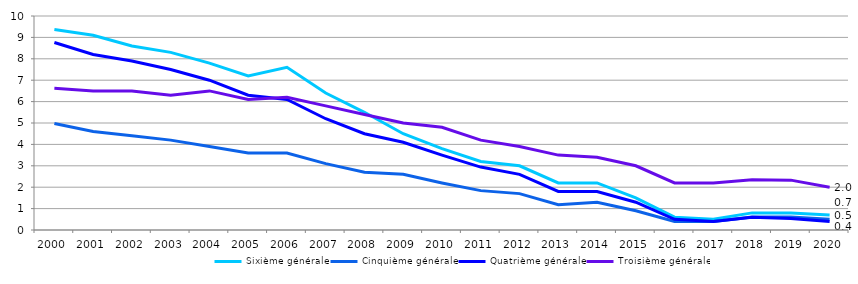
| Category | Sixième générale | Cinquième générale | Quatrième générale | Troisième générale |
|---|---|---|---|---|
| 2000.0 | 9.365 | 4.978 | 8.761 | 6.62 |
| 2001.0 | 9.1 | 4.6 | 8.2 | 6.5 |
| 2002.0 | 8.6 | 4.4 | 7.9 | 6.5 |
| 2003.0 | 8.3 | 4.2 | 7.5 | 6.3 |
| 2004.0 | 7.8 | 3.9 | 7 | 6.5 |
| 2005.0 | 7.2 | 3.6 | 6.3 | 6.1 |
| 2006.0 | 7.6 | 3.6 | 6.1 | 6.2 |
| 2007.0 | 6.4 | 3.1 | 5.2 | 5.8 |
| 2008.0 | 5.5 | 2.7 | 4.5 | 5.4 |
| 2009.0 | 4.5 | 2.6 | 4.1 | 5 |
| 2010.0 | 3.8 | 2.2 | 3.5 | 4.8 |
| 2011.0 | 3.2 | 1.84 | 2.94 | 4.2 |
| 2012.0 | 3 | 1.7 | 2.6 | 3.9 |
| 2013.0 | 2.2 | 1.18 | 1.8 | 3.5 |
| 2014.0 | 2.2 | 1.3 | 1.8 | 3.4 |
| 2015.0 | 1.5 | 0.9 | 1.3 | 3 |
| 2016.0 | 0.6 | 0.4 | 0.5 | 2.2 |
| 2017.0 | 0.5 | 0.4 | 0.4 | 2.2 |
| 2018.0 | 0.8 | 0.61 | 0.59 | 2.35 |
| 2019.0 | 0.8 | 0.61 | 0.54 | 2.33 |
| 2020.0 | 0.7 | 0.5 | 0.4 | 2 |